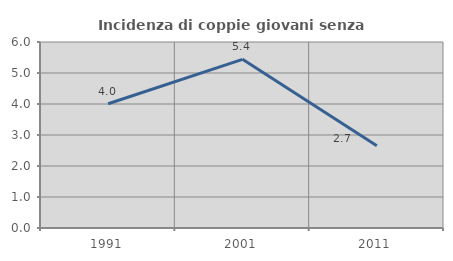
| Category | Incidenza di coppie giovani senza figli |
|---|---|
| 1991.0 | 4.007 |
| 2001.0 | 5.44 |
| 2011.0 | 2.656 |